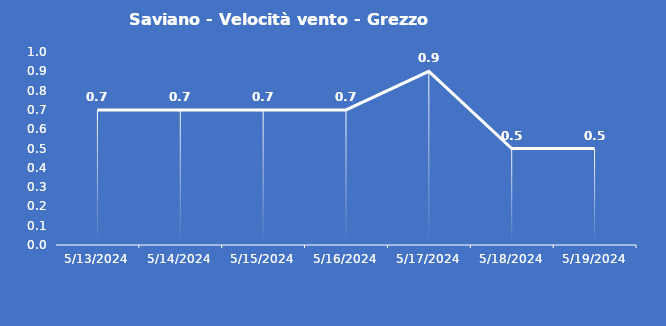
| Category | Saviano - Velocità vento - Grezzo (m/s) |
|---|---|
| 5/13/24 | 0.7 |
| 5/14/24 | 0.7 |
| 5/15/24 | 0.7 |
| 5/16/24 | 0.7 |
| 5/17/24 | 0.9 |
| 5/18/24 | 0.5 |
| 5/19/24 | 0.5 |